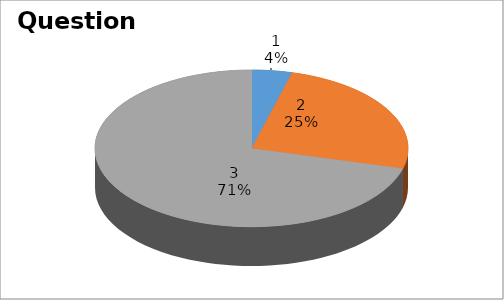
| Category | Series 0 |
|---|---|
| 0 | 1 |
| 1 | 6 |
| 2 | 17 |